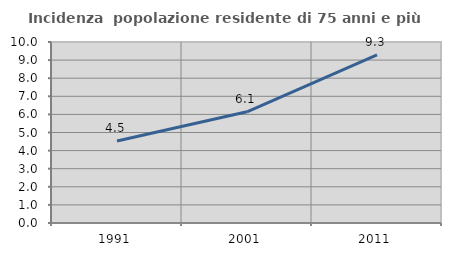
| Category | Incidenza  popolazione residente di 75 anni e più |
|---|---|
| 1991.0 | 4.533 |
| 2001.0 | 6.144 |
| 2011.0 | 9.291 |